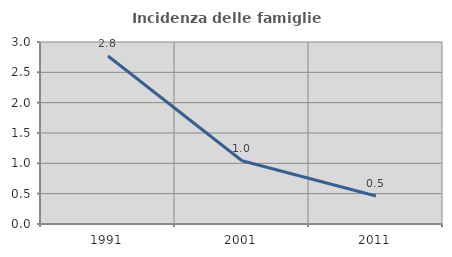
| Category | Incidenza delle famiglie numerose |
|---|---|
| 1991.0 | 2.77 |
| 2001.0 | 1.042 |
| 2011.0 | 0.462 |